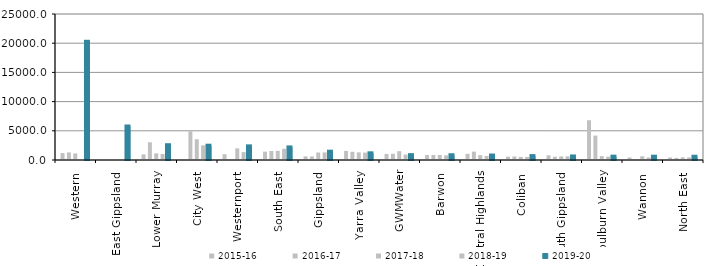
| Category | 2015-16 | 2016-17 | 2017-18 | 2018-19 | 2019-20 |
|---|---|---|---|---|---|
| Western  | 1188 | 1300 | 1123 | 0 | 20241.13 |
| East Gippsland  | 0 | 0 | 0 | 0 | 5740.42 |
| Lower Murray  | 960.75 | 3032 | 1142.58 | 1024.98 | 2534 |
| City West  | 0 | 4916.79 | 3554 | 2513.92 | 2447.647 |
| Westernport  | 995 | 0 | 1993 | 1348 | 2333 |
| South East  | 1435 | 1544 | 1572 | 1919.36 | 2151.879 |
| Gippsland  | 622.08 | 611 | 1281 | 1302 | 1426 |
| Yarra Valley  | 1554.87 | 1403 | 1308.51 | 1263.83 | 1143.19 |
| GWMWater | 1041 | 1068.966 | 1512.586 | 928.104 | 831.116 |
| Barwon  | 855.512 | 868 | 867 | 794 | 811.2 |
| Central Highlands  | 1062 | 1431 | 832 | 695 | 764.14 |
| Coliban  | 572 | 603 | 526.94 | 520.66 | 667 |
| South Gippsland  | 804 | 569 | 610 | 634.5 | 608 |
| Goulburn Valley  | 6807 | 4180 | 667.26 | 573 | 570.41 |
| Wannon  | 429 | 0 | 643 | 431 | 566 |
| North East  | 428.2 | 363 | 448 | 443.43 | 558.86 |